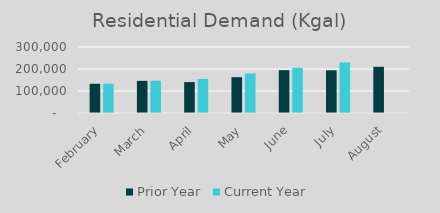
| Category | Prior Year | Current Year |
|---|---|---|
| February | 132905 | 133616 |
| March | 146212 | 146882 |
| April | 140621 | 154955 |
| May | 162790 | 179419 |
| June | 194665 | 205078 |
| July | 194086 | 229973 |
| August | 209888 | 0 |